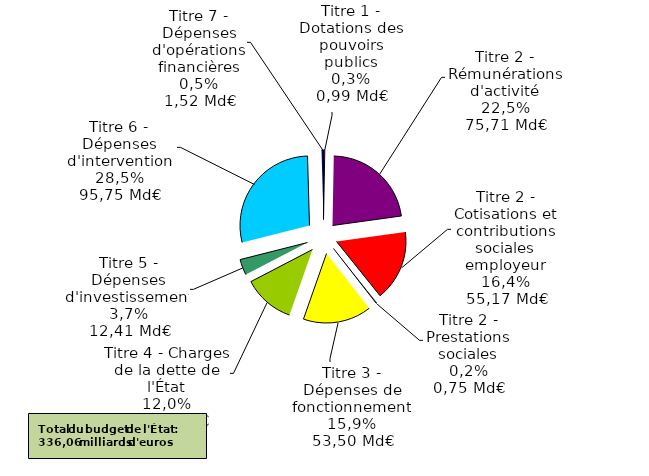
| Category | Part dans le budget de l'État en 2019 (en %) |
|---|---|
| Titre 1 - Dotations des pouvoirs publics | 0.003 |
| Titre 2 - Rémunérations d'activité | 0.225 |
| Titre 2 - Cotisations et contributions sociales employeur | 0.164 |
| Titre 2 - Prestations sociales | 0.002 |
| Titre 3 - Dépenses de fonctionnement | 0.159 |
| Titre 4 - Charges de la dette de l'État | 0.12 |
| Titre 5 - Dépenses d'investissement | 0.037 |
| Titre 6 - Dépenses d'intervention | 0.285 |
| Titre 7 - Dépenses d'opérations financières | 0.005 |